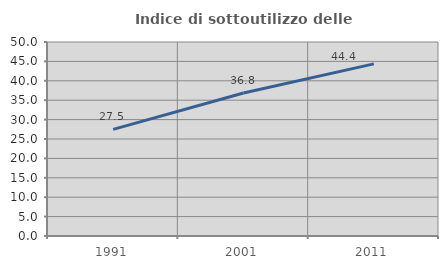
| Category | Indice di sottoutilizzo delle abitazioni  |
|---|---|
| 1991.0 | 27.481 |
| 2001.0 | 36.842 |
| 2011.0 | 44.369 |